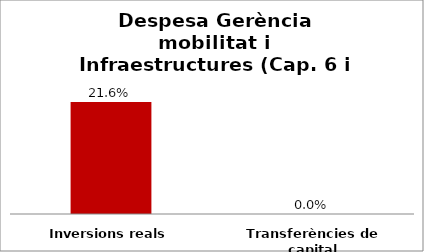
| Category | Series 0 |
|---|---|
| Inversions reals | 0.216 |
| Transferències de capital | 0 |